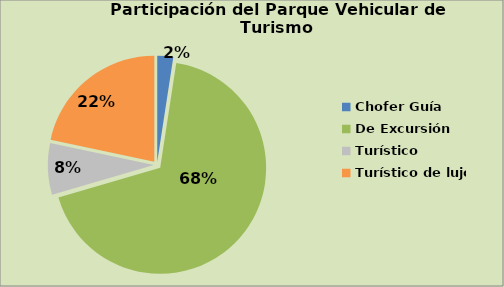
| Category | Series 0 |
|---|---|
| Chofer Guía | 2.426 |
| De Excursión | 68.061 |
| Turístico | 7.849 |
| Turístico de lujo | 21.663 |